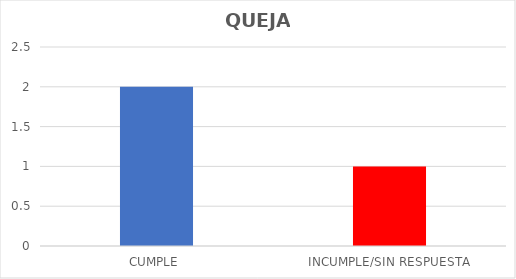
| Category | TOTAL |
|---|---|
| CUMPLE | 2 |
| INCUMPLE/SIN RESPUESTA | 1 |